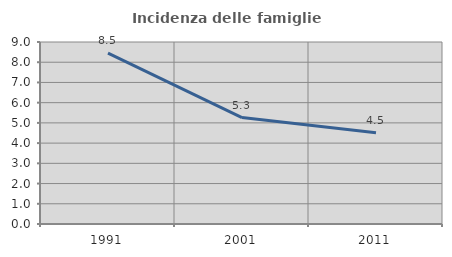
| Category | Incidenza delle famiglie numerose |
|---|---|
| 1991.0 | 8.451 |
| 2001.0 | 5.263 |
| 2011.0 | 4.517 |